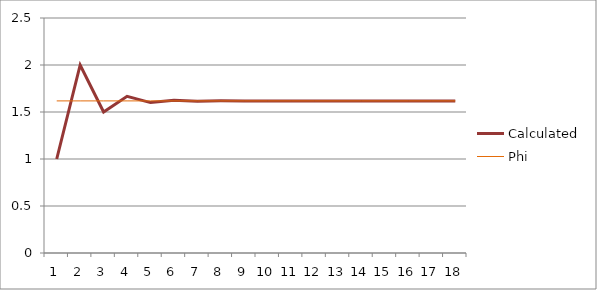
| Category | Calculated | Phi |
|---|---|---|
| 0 | 1 | 1.618 |
| 1 | 2 | 1.618 |
| 2 | 1.5 | 1.618 |
| 3 | 1.667 | 1.618 |
| 4 | 1.6 | 1.618 |
| 5 | 1.625 | 1.618 |
| 6 | 1.615 | 1.618 |
| 7 | 1.619 | 1.618 |
| 8 | 1.618 | 1.618 |
| 9 | 1.618 | 1.618 |
| 10 | 1.618 | 1.618 |
| 11 | 1.618 | 1.618 |
| 12 | 1.618 | 1.618 |
| 13 | 1.618 | 1.618 |
| 14 | 1.618 | 1.618 |
| 15 | 1.618 | 1.618 |
| 16 | 1.618 | 1.618 |
| 17 | 1.618 | 1.618 |